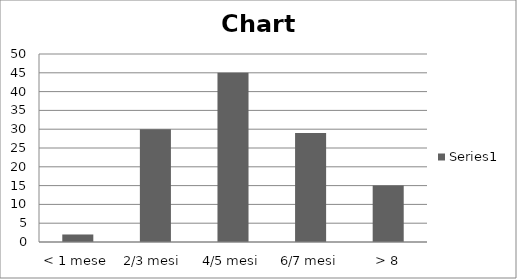
| Category | Series 0 |
|---|---|
| < 1 mese | 2 |
| 2/3 mesi  | 30 |
| 4/5 mesi | 45 |
| 6/7 mesi | 29 |
| > 8 | 15 |